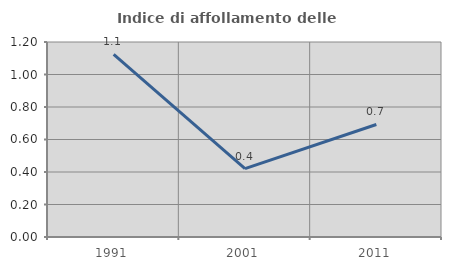
| Category | Indice di affollamento delle abitazioni  |
|---|---|
| 1991.0 | 1.123 |
| 2001.0 | 0.421 |
| 2011.0 | 0.693 |